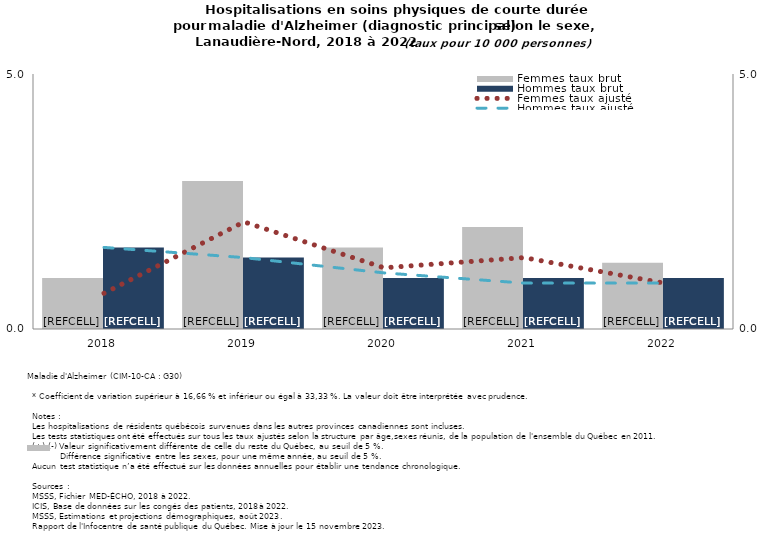
| Category | Femmes taux brut | Hommes taux brut |
|---|---|---|
| 2018.0 | 1 | 1.6 |
| 2019.0 | 2.9 | 1.4 |
| 2020.0 | 1.6 | 1 |
| 2021.0 | 2 | 1 |
| 2022.0 | 1.3 | 1 |